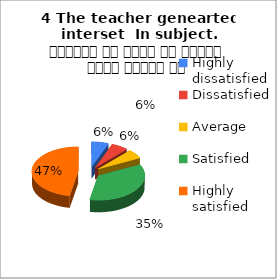
| Category | 4 The teacher genearted interset  In subject. शिक्षक ने विषय के प्रति रुचि जागृत की |
|---|---|
| Highly dissatisfied | 1 |
| Dissatisfied | 1 |
| Average | 1 |
| Satisfied | 6 |
| Highly satisfied | 8 |